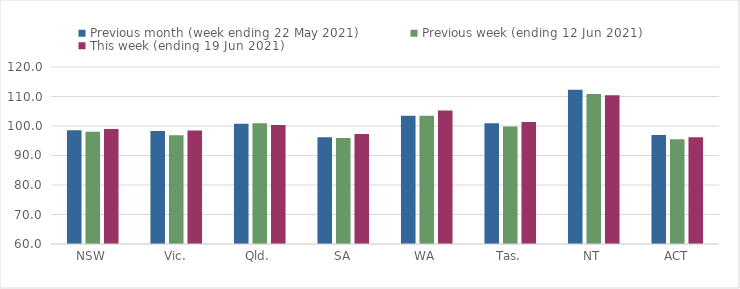
| Category | Previous month (week ending 22 May 2021) | Previous week (ending 12 Jun 2021) | This week (ending 19 Jun 2021) |
|---|---|---|---|
| NSW | 98.52 | 98.06 | 98.99 |
| Vic. | 98.28 | 96.9 | 98.47 |
| Qld. | 100.77 | 100.97 | 100.34 |
| SA | 96.15 | 95.95 | 97.32 |
| WA | 103.47 | 103.44 | 105.28 |
| Tas. | 100.97 | 99.82 | 101.33 |
| NT | 112.33 | 110.87 | 110.43 |
| ACT | 96.98 | 95.55 | 96.17 |